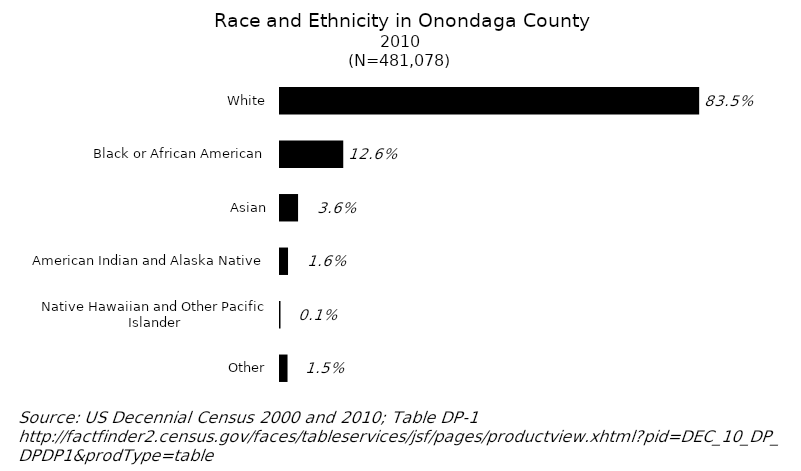
| Category | 2010 (N=481,078) |
|---|---|
| Other | 0.015 |
| Native Hawaiian and Other Pacific Islander | 0.001 |
| American Indian and Alaska Native | 0.016 |
| Asian | 0.036 |
| Black or African American | 0.126 |
| White | 0.835 |